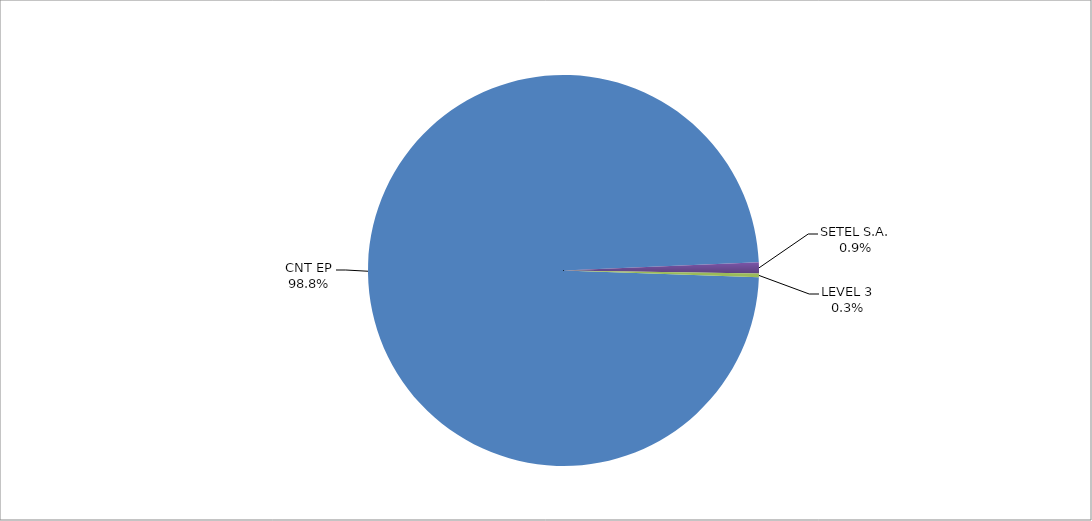
| Category | Series 0 |
|---|---|
| CNT EP | 321 |
| SETEL S.A. | 3 |
| LEVEL 3 | 1 |